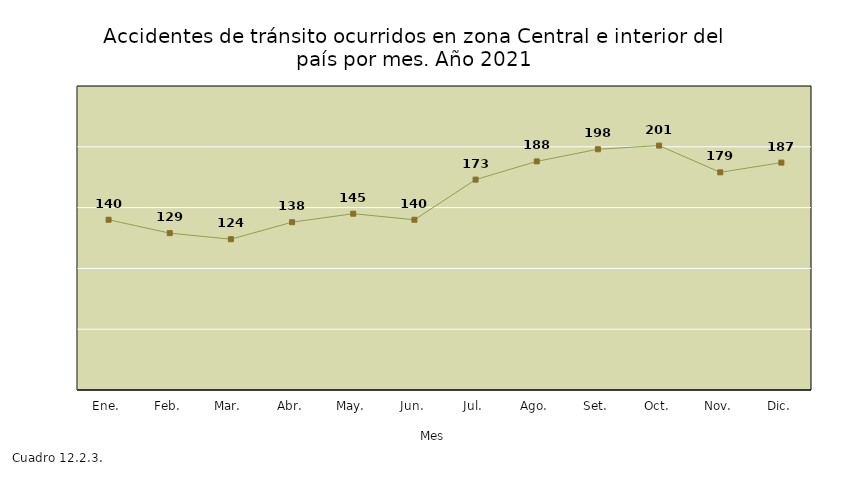
| Category | Series 0 |
|---|---|
| Ene. | 140 |
| Feb. | 129 |
| Mar. | 124 |
| Abr. | 138 |
| May. | 145 |
| Jun. | 140 |
| Jul. | 173 |
| Ago. | 188 |
| Set. | 198 |
| Oct. | 201 |
| Nov. | 179 |
| Dic. | 187 |